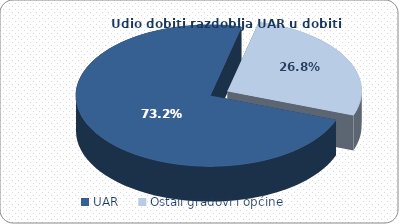
| Category | Dobit razdoblja |
|---|---|
| UAR | 1580424.339 |
| Ostali gradovi i općine | 578812.61 |